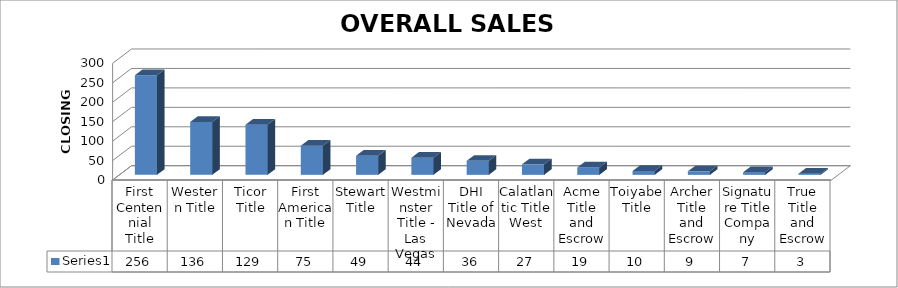
| Category | Series 0 |
|---|---|
| First Centennial Title | 256 |
| Western Title | 136 |
| Ticor Title | 129 |
| First American Title | 75 |
| Stewart Title | 49 |
| Westminster Title - Las Vegas | 44 |
| DHI Title of Nevada | 36 |
| Calatlantic Title West | 27 |
| Acme Title and Escrow | 19 |
| Toiyabe Title | 10 |
| Archer Title and Escrow | 9 |
| Signature Title Company | 7 |
| True Title and Escrow | 3 |